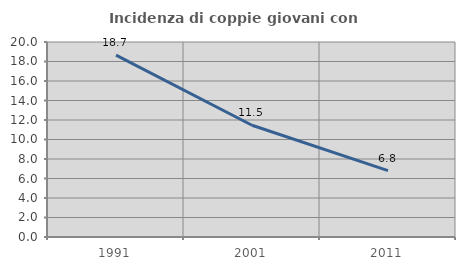
| Category | Incidenza di coppie giovani con figli |
|---|---|
| 1991.0 | 18.656 |
| 2001.0 | 11.463 |
| 2011.0 | 6.804 |